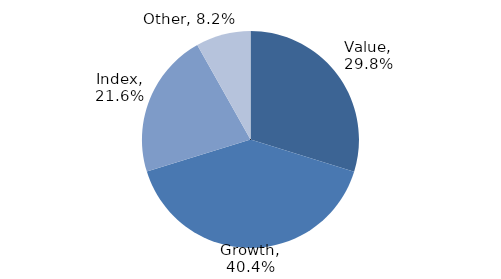
| Category | Investment Style |
|---|---|
| Value | 0.298 |
| Growth | 0.404 |
| Index | 0.216 |
| Other | 0.082 |